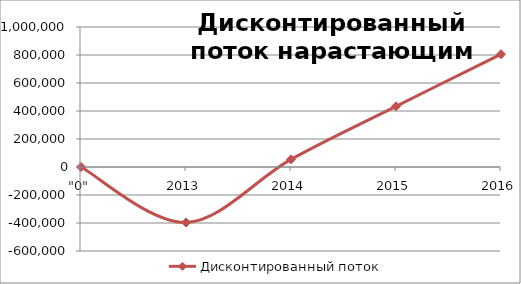
| Category | Дисконтированный поток нарастающим итогом |
|---|---|
| "0" | 0 |
| 2013 | -396376.59 |
| 2014 | 54868.636 |
| 2015 | 433539.586 |
| 2016 | 805492.687 |